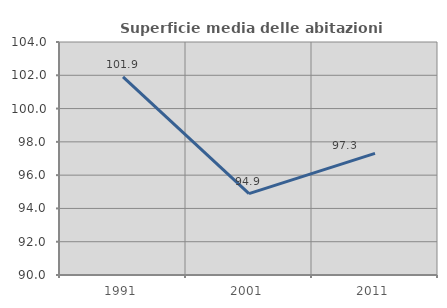
| Category | Superficie media delle abitazioni occupate |
|---|---|
| 1991.0 | 101.903 |
| 2001.0 | 94.886 |
| 2011.0 | 97.307 |